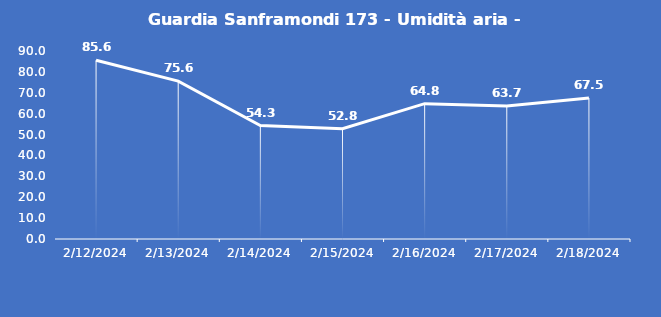
| Category | Guardia Sanframondi 173 - Umidità aria - Grezzo (%) |
|---|---|
| 2/12/24 | 85.6 |
| 2/13/24 | 75.6 |
| 2/14/24 | 54.3 |
| 2/15/24 | 52.8 |
| 2/16/24 | 64.8 |
| 2/17/24 | 63.7 |
| 2/18/24 | 67.5 |